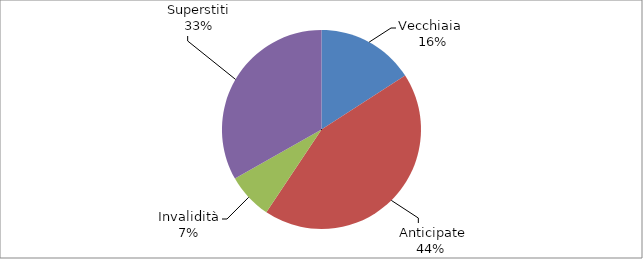
| Category | Series 0 |
|---|---|
| Vecchiaia  | 12970 |
|  Anticipate | 35468 |
| Invalidità | 6076 |
| Superstiti | 27100 |